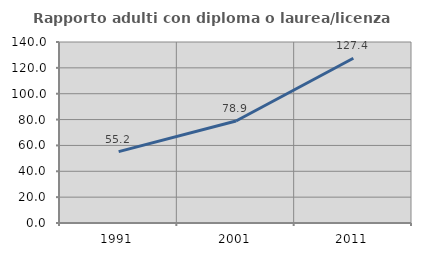
| Category | Rapporto adulti con diploma o laurea/licenza media  |
|---|---|
| 1991.0 | 55.208 |
| 2001.0 | 78.862 |
| 2011.0 | 127.434 |